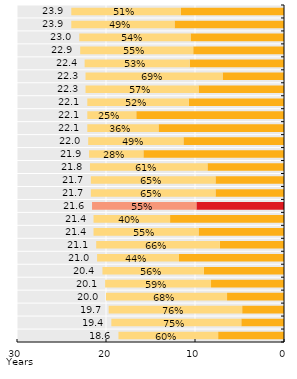
| Category | Healthy life years | Life expectancy with activity limitation | Series 0 |
|---|---|---|---|
| 0.5146443514644351 | 11.6 | 12.3 | 23.9 |
| 0.4853556485355648 | 12.3 | 11.6 | 23.9 |
| 0.5434782608695652 | 10.5 | 12.5 | 23 |
| 0.5545851528384279 | 10.2 | 12.7 | 22.9 |
| 0.5267857142857143 | 10.6 | 11.8 | 22.4 |
| 0.6905829596412556 | 6.9 | 15.4 | 22.3 |
| 0.5695067264573991 | 9.6 | 12.7 | 22.3 |
| 0.5158371040723982 | 10.7 | 11.4 | 22.1 |
| 0.24886877828054296 | 16.6 | 5.5 | 22.1 |
| 0.3619909502262444 | 14.1 | 8 | 22.1 |
| 0.48636363636363633 | 11.3 | 10.7 | 22 |
| 0.27853881278538806 | 15.8 | 6.1 | 21.9 |
| 0.6055045871559633 | 8.6 | 13.2 | 21.8 |
| 0.6451612903225806 | 7.7 | 14 | 21.7 |
| 0.6451612903225806 | 7.7 | 14 | 21.7 |
| 0.5467804723876779 | 9.844 | 11.724 | 21.568 |
| 0.4018691588785046 | 12.8 | 8.6 | 21.4 |
| 0.5514018691588785 | 9.6 | 11.8 | 21.4 |
| 0.6587677725118484 | 7.2 | 13.9 | 21.1 |
| 0.43809523809523804 | 11.8 | 9.2 | 21 |
| 0.5588235294117647 | 9 | 11.4 | 20.4 |
| 0.592039800995025 | 8.2 | 11.9 | 20.1 |
| 0.6799999999999999 | 6.4 | 13.6 | 20 |
| 0.7614213197969544 | 4.7 | 15 | 19.7 |
| 0.7525773195876289 | 4.8 | 14.6 | 19.4 |
| 0.6021505376344086 | 7.4 | 11.2 | 18.6 |